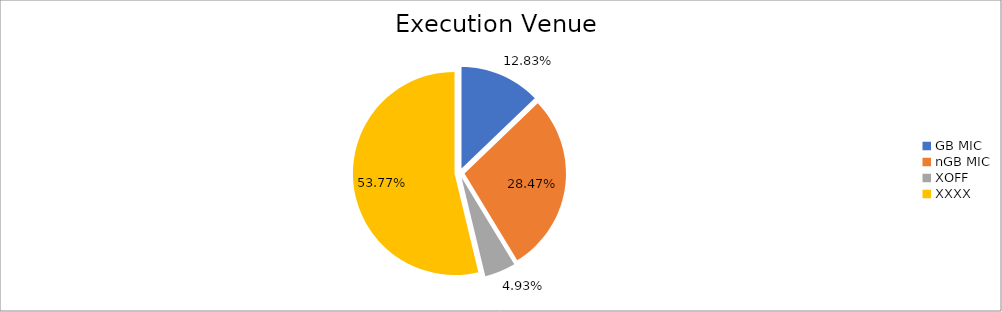
| Category | Series 0 |
|---|---|
| GB MIC | 1170345.196 |
| nGB MIC | 2598061.142 |
| XOFF | 449444.346 |
| XXXX | 4906257.024 |